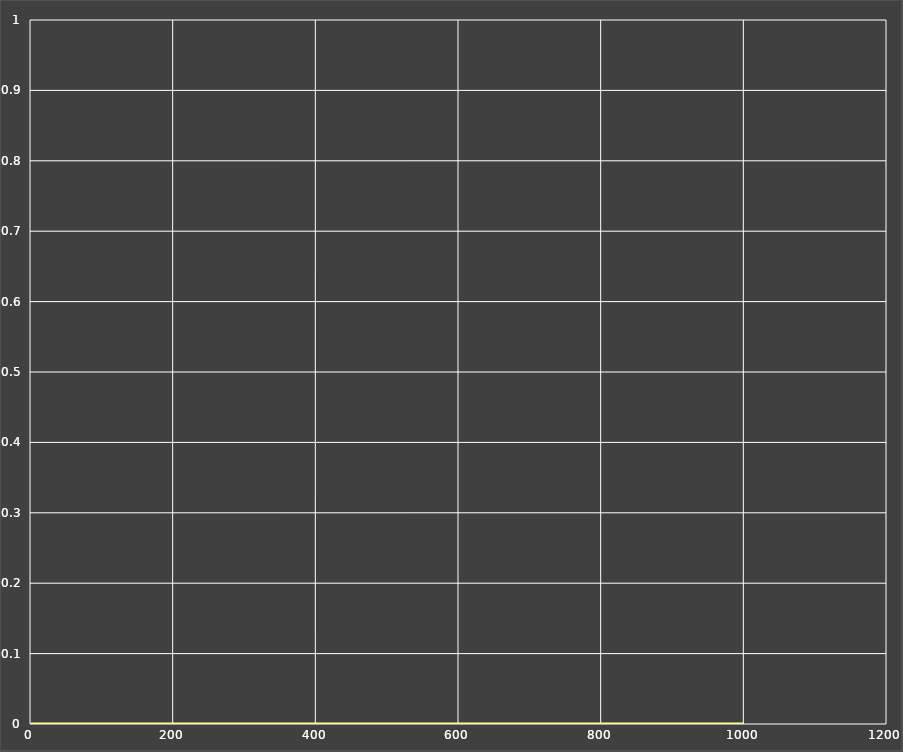
| Category | Nyquist |
|---|---|
| 0.9991501637305895 | -0.04 |
| 0.9991343671949188 | -0.04 |
| 0.9991182770960546 | -0.041 |
| 0.9991018879806148 | -0.041 |
| 0.9990851942939946 | -0.041 |
| 0.9990681903784916 | -0.042 |
| 0.9990508704713954 | -0.042 |
| 0.9990332287030411 | -0.043 |
| 0.9990152590948289 | -0.043 |
| 0.998996955557205 | -0.043 |
| 0.9989783118876068 | -0.044 |
| 0.9989593217683693 | -0.044 |
| 0.9989399787645931 | -0.045 |
| 0.9989202763219736 | -0.045 |
| 0.9989002077645885 | -0.045 |
| 0.9988797662926473 | -0.046 |
| 0.9988589449801962 | -0.046 |
| 0.9988377367727824 | -0.047 |
| 0.9988161344850759 | -0.047 |
| 0.9987941307984454 | -0.048 |
| 0.9987717182584913 | -0.048 |
| 0.998748889272533 | -0.049 |
| 0.9987256361070489 | -0.049 |
| 0.9987019508850702 | -0.049 |
| 0.998677825583526 | -0.05 |
| 0.9986532520305412 | -0.05 |
| 0.9986282219026813 | -0.051 |
| 0.9986027267221499 | -0.051 |
| 0.9985767578539334 | -0.052 |
| 0.9985503065028913 | -0.052 |
| 0.9985233637107972 | -0.053 |
| 0.9984959203533205 | -0.053 |
| 0.998467967136956 | -0.054 |
| 0.9984394945958955 | -0.054 |
| 0.9984104930888433 | -0.055 |
| 0.9983809527957705 | -0.055 |
| 0.9983508637146129 | -0.056 |
| 0.9983202156579057 | -0.056 |
| 0.9982889982493576 | -0.057 |
| 0.9982572009203619 | -0.057 |
| 0.9982248129064434 | -0.058 |
| 0.9981918232436395 | -0.058 |
| 0.9981582207648163 | -0.059 |
| 0.9981239940959151 | -0.059 |
| 0.9980891316521329 | -0.06 |
| 0.9980536216340291 | -0.06 |
| 0.9980174520235643 | -0.061 |
| 0.9979806105800648 | -0.062 |
| 0.9979430848361128 | -0.062 |
| 0.997904862093363 | -0.063 |
| 0.9978659294182808 | -0.063 |
| 0.9978262736378027 | -0.064 |
| 0.9977858813349192 | -0.065 |
| 0.9977447388441743 | -0.065 |
| 0.9977028322470843 | -0.066 |
| 0.9976601473674721 | -0.066 |
| 0.9976166697667167 | -0.067 |
| 0.9975723847389152 | -0.068 |
| 0.9975272773059577 | -0.068 |
| 0.9974813322125106 | -0.069 |
| 0.9974345339209094 | -0.069 |
| 0.9973868666059583 | -0.07 |
| 0.9973383141496339 | -0.071 |
| 0.9972888601356941 | -0.071 |
| 0.9972384878441867 | -0.072 |
| 0.9971871802458594 | -0.073 |
| 0.9971349199964673 | -0.073 |
| 0.9970816894309772 | -0.074 |
| 0.9970274705576654 | -0.075 |
| 0.9969722450521098 | -0.075 |
| 0.9969159942510705 | -0.076 |
| 0.9968586991462617 | -0.077 |
| 0.9968003403780082 | -0.078 |
| 0.9967408982287882 | -0.078 |
| 0.996680352616657 | -0.079 |
| 0.9966186830885545 | -0.08 |
| 0.9965558688134877 | -0.08 |
| 0.9964918885755923 | -0.081 |
| 0.9964267207670672 | -0.082 |
| 0.996360343380981 | -0.083 |
| 0.9962927340039489 | -0.083 |
| 0.9962238698086776 | -0.084 |
| 0.9961537275463725 | -0.085 |
| 0.9960822835390121 | -0.086 |
| 0.996009513671479 | -0.087 |
| 0.9959353933835502 | -0.087 |
| 0.995859897661744 | -0.088 |
| 0.9957830010310169 | -0.089 |
| 0.9957046775463149 | -0.09 |
| 0.9956249007839686 | -0.091 |
| 0.9955436438329358 | -0.091 |
| 0.9954608792858859 | -0.092 |
| 0.9953765792301241 | -0.093 |
| 0.9952907152383519 | -0.094 |
| 0.995203258359262 | -0.095 |
| 0.9951141791079655 | -0.096 |
| 0.9950234474562457 | -0.097 |
| 0.9949310328226382 | -0.098 |
| 0.9948369040623325 | -0.098 |
| 0.9947410294568952 | -0.099 |
| 0.9946433767038058 | -0.1 |
| 0.9945439129058088 | -0.101 |
| 0.9944426045600739 | -0.102 |
| 0.9943394175471633 | -0.103 |
| 0.9942343171198019 | -0.104 |
| 0.9941272678914487 | -0.105 |
| 0.9940182338246633 | -0.106 |
| 0.9939071782192669 | -0.107 |
| 0.9937940637002908 | -0.108 |
| 0.9936788522057145 | -0.109 |
| 0.9935615049739829 | -0.11 |
| 0.9934419825313037 | -0.111 |
| 0.9933202446787208 | -0.112 |
| 0.9931962504789579 | -0.113 |
| 0.9930699582430293 | -0.114 |
| 0.9929413255166173 | -0.115 |
| 0.9928103090662043 | -0.116 |
| 0.9926768648649661 | -0.117 |
| 0.9925409480784136 | -0.118 |
| 0.9924025130497828 | -0.119 |
| 0.9922615132851698 | -0.12 |
| 0.9921179014384024 | -0.122 |
| 0.9919716292956502 | -0.123 |
| 0.991822647759762 | -0.124 |
| 0.9916709068343326 | -0.125 |
| 0.9915163556074892 | -0.126 |
| 0.9913589422353963 | -0.127 |
| 0.9911986139254744 | -0.128 |
| 0.9910353169193247 | -0.13 |
| 0.9908689964753594 | -0.131 |
| 0.9906995968511311 | -0.132 |
| 0.9905270612853533 | -0.133 |
| 0.9903513319796141 | -0.134 |
| 0.9901723500797721 | -0.136 |
| 0.989990055657032 | -0.137 |
| 0.989804387688694 | -0.138 |
| 0.9896152840385742 | -0.139 |
| 0.9894226814370876 | -0.141 |
| 0.98922651546099 | -0.142 |
| 0.9890267205127756 | -0.143 |
| 0.9888232297997199 | -0.145 |
| 0.9886159753125681 | -0.146 |
| 0.9884048878038604 | -0.147 |
| 0.9881898967658889 | -0.149 |
| 0.9879709304082812 | -0.15 |
| 0.9877479156352061 | -0.151 |
| 0.9875207780221927 | -0.153 |
| 0.9872894417925607 | -0.154 |
| 0.9870538297934535 | -0.156 |
| 0.9868138634714707 | -0.157 |
| 0.9865694628478907 | -0.158 |
| 0.9863205464934823 | -0.16 |
| 0.9860670315028943 | -0.161 |
| 0.9858088334686198 | -0.163 |
| 0.9855458664545306 | -0.164 |
| 0.9852780429689716 | -0.166 |
| 0.9850052739374122 | -0.167 |
| 0.9847274686746476 | -0.169 |
| 0.9844445348565442 | -0.17 |
| 0.9841563784913205 | -0.172 |
| 0.9838629038903625 | -0.174 |
| 0.9835640136385599 | -0.175 |
| 0.9832596085641645 | -0.177 |
| 0.9829495877081578 | -0.178 |
| 0.9826338482931263 | -0.18 |
| 0.9823122856916345 | -0.182 |
| 0.9819847933940925 | -0.183 |
| 0.9816512629761076 | -0.185 |
| 0.9813115840653183 | -0.187 |
| 0.9809656443077005 | -0.188 |
| 0.9806133293333401 | -0.19 |
| 0.980254522721668 | -0.192 |
| 0.9798891059661461 | -0.194 |
| 0.9795169584384044 | -0.195 |
| 0.9791379573518169 | -0.197 |
| 0.978751977724512 | -0.199 |
| 0.9783588923418128 | -0.201 |
| 0.9779585717180984 | -0.202 |
| 0.9775508840580799 | -0.204 |
| 0.9771356952174872 | -0.206 |
| 0.9767128686631581 | -0.208 |
| 0.9762822654325236 | -0.21 |
| 0.9758437440924852 | -0.212 |
| 0.9753971606976753 | -0.214 |
| 0.9749423687480981 | -0.216 |
| 0.9744792191461407 | -0.218 |
| 0.9740075601529525 | -0.22 |
| 0.9735272373441879 | -0.222 |
| 0.9730380935650998 | -0.224 |
| 0.9725399688849873 | -0.226 |
| 0.9720327005509861 | -0.228 |
| 0.9715161229411998 | -0.23 |
| 0.970990067517165 | -0.232 |
| 0.970454362775645 | -0.234 |
| 0.969908834199751 | -0.236 |
| 0.9693533042093818 | -0.238 |
| 0.9687875921109794 | -0.24 |
| 0.9682115140465983 | -0.243 |
| 0.9676248829422817 | -0.245 |
| 0.9670275084557424 | -0.247 |
| 0.9664191969233449 | -0.249 |
| 0.9657997513063865 | -0.251 |
| 0.9651689711366718 | -0.254 |
| 0.9645266524613821 | -0.256 |
| 0.9638725877872346 | -0.258 |
| 0.96320656602393 | -0.261 |
| 0.9625283724268882 | -0.263 |
| 0.9618377885392713 | -0.265 |
| 0.9611345921332898 | -0.268 |
| 0.9604185571507983 | -0.27 |
| 0.9596894536431729 | -0.272 |
| 0.9589470477104785 | -0.275 |
| 0.9581911014399224 | -0.277 |
| 0.9574213728435982 | -0.28 |
| 0.9566376157955211 | -0.282 |
| 0.9558395799679589 | -0.285 |
| 0.9550270107670604 | -0.287 |
| 0.9541996492677886 | -0.29 |
| 0.9533572321481586 | -0.293 |
| 0.9524994916227901 | -0.295 |
| 0.9516261553757803 | -0.298 |
| 0.9507369464929007 | -0.3 |
| 0.949831583393131 | -0.303 |
| 0.9489097797595337 | -0.306 |
| 0.9479712444694841 | -0.309 |
| 0.9470156815242609 | -0.311 |
| 0.9460427899780138 | -0.314 |
| 0.9450522638661172 | -0.317 |
| 0.9440437921329259 | -0.32 |
| 0.9430170585589459 | -0.322 |
| 0.9419717416874376 | -0.325 |
| 0.940907514750466 | -0.328 |
| 0.93982404559442 | -0.331 |
| 0.9387209966050177 | -0.334 |
| 0.9375980246318181 | -0.337 |
| 0.9364547809122643 | -0.34 |
| 0.9352909109952804 | -0.343 |
| 0.9341060546644463 | -0.346 |
| 0.9328998458607818 | -0.349 |
| 0.931671912605162 | -0.352 |
| 0.9304218769204009 | -0.355 |
| 0.929149354753032 | -0.358 |
| 0.9278539558948189 | -0.361 |
| 0.9265352839040367 | -0.364 |
| 0.9251929360265561 | -0.368 |
| 0.9238265031167744 | -0.371 |
| 0.9224355695584358 | -0.374 |
| 0.9210197131853821 | -0.377 |
| 0.9195785052022852 | -0.381 |
| 0.9181115101054066 | -0.384 |
| 0.9166182856034376 | -0.387 |
| 0.9150983825384778 | -0.391 |
| 0.9135513448072002 | -0.394 |
| 0.9119767092822747 | -0.397 |
| 0.9103740057341015 | -0.401 |
| 0.9087427567529288 | -0.404 |
| 0.9070824776714196 | -0.408 |
| 0.9053926764877394 | -0.411 |
| 0.9036728537892437 | -0.415 |
| 0.9019225026768408 | -0.418 |
| 0.9001411086901143 | -0.422 |
| 0.8983281497332919 | -0.425 |
| 0.8964830960021487 | -0.429 |
| 0.894605409911942 | -0.433 |
| 0.8926945460264721 | -0.436 |
| 0.8907499509883752 | -0.44 |
| 0.8887710634507526 | -0.444 |
| 0.8867573140102475 | -0.447 |
| 0.8847081251416883 | -0.451 |
| 0.8826229111344134 | -0.455 |
| 0.8805010780304087 | -0.459 |
| 0.8783420235643867 | -0.463 |
| 0.8761451371059398 | -0.466 |
| 0.8739097996039152 | -0.47 |
| 0.8716353835331531 | -0.474 |
| 0.8693212528437436 | -0.478 |
| 0.8669667629129613 | -0.482 |
| 0.8645712605000389 | -0.486 |
| 0.8621340837039554 | -0.49 |
| 0.8596545619244136 | -0.494 |
| 0.8571320158261907 | -0.498 |
| 0.854565757307054 | -0.502 |
| 0.851955089469441 | -0.506 |
| 0.8492993065961029 | -0.511 |
| 0.8465976941299335 | -0.515 |
| 0.8438495286581968 | -0.519 |
| 0.8410540779013798 | -0.523 |
| 0.8382106007069139 | -0.527 |
| 0.835318347048002 | -0.532 |
| 0.8323765580278065 | -0.536 |
| 0.8293844658892603 | -0.54 |
| 0.8263412940307678 | -0.544 |
| 0.8232462570280781 | -0.549 |
| 0.8200985606626151 | -0.553 |
| 0.8168974019565658 | -0.557 |
| 0.8136419692150314 | -0.562 |
| 0.8103314420755584 | -0.566 |
| 0.8069649915653779 | -0.571 |
| 0.8035417801666908 | -0.575 |
| 0.8000609618903448 | -0.58 |
| 0.7965216823582649 | -0.584 |
| 0.7929230788950018 | -0.588 |
| 0.7892642806287868 | -0.593 |
| 0.7855444086024744 | -0.598 |
| 0.7817625758947864 | -0.602 |
| 0.7779178877522651 | -0.607 |
| 0.7740094417323644 | -0.611 |
| 0.7700363278581212 | -0.616 |
| 0.7659976287848487 | -0.62 |
| 0.7618924199793266 | -0.625 |
| 0.7577197699119546 | -0.63 |
| 0.7534787402623604 | -0.634 |
| 0.7491683861389656 | -0.639 |
| 0.744787756313019 | -0.644 |
| 0.7403358934676256 | -0.648 |
| 0.7358118344623135 | -0.653 |
| 0.731214610613687 | -0.658 |
| 0.7265432479927353 | -0.663 |
| 0.7217967677393728 | -0.667 |
| 0.7169741863948089 | -0.672 |
| 0.7120745162523425 | -0.677 |
| 0.707096765727212 | -0.681 |
| 0.7020399397461238 | -0.686 |
| 0.6969030401571047 | -0.691 |
| 0.6916850661603424 | -0.696 |
| 0.6863850147606742 | -0.7 |
| 0.6810018812424166 | -0.705 |
| 0.6755346596672237 | -0.71 |
| 0.6699823433956869 | -0.715 |
| 0.6643439256333912 | -0.719 |
| 0.6586184000021629 | -0.724 |
| 0.6528047611372474 | -0.729 |
| 0.6469020053111709 | -0.734 |
| 0.6409091310850527 | -0.738 |
| 0.6348251399881327 | -0.743 |
| 0.6286490372263078 | -0.748 |
| 0.6223798324204571 | -0.752 |
| 0.6160165403753636 | -0.757 |
| 0.6095581818800322 | -0.762 |
| 0.6030037845402217 | -0.766 |
| 0.5963523836440049 | -0.771 |
| 0.5896030230611843 | -0.776 |
| 0.5827547561773845 | -0.78 |
| 0.5758066468636579 | -0.785 |
| 0.568757770482425 | -0.789 |
| 0.5616072149305893 | -0.794 |
| 0.5543540817206526 | -0.798 |
| 0.5469974871006545 | -0.803 |
| 0.5395365632137659 | -0.807 |
| 0.5319704592983484 | -0.812 |
| 0.5242983429292923 | -0.816 |
| 0.5165194013014316 | -0.82 |
| 0.5086328425558272 | -0.825 |
| 0.5006378971496946 | -0.829 |
| 0.492533819270735 | -0.833 |
| 0.48431988829661177 | -0.837 |
| 0.4759954103003018 | -0.841 |
| 0.4675597196020108 | -0.845 |
| 0.4590121803683403 | -0.849 |
| 0.450352188259339 | -0.853 |
| 0.4415791721240683 | -0.857 |
| 0.4326925957452532 | -0.861 |
| 0.42369195963356426 | -0.865 |
| 0.414576802872041 | -0.868 |
| 0.40534670501110487 | -0.872 |
| 0.39600128801458184 | -0.875 |
| 0.3865402182570908 | -0.879 |
| 0.3769632085730966 | -0.882 |
| 0.36727002035788253 | -0.886 |
| 0.357460465720607 | -0.889 |
| 0.3475344096895692 | -0.892 |
| 0.33749177246970796 | -0.895 |
| 0.3273325317523055 | -0.898 |
| 0.3170567250767599 | -0.901 |
| 0.30666445224422145 | -0.904 |
| 0.29615587778278674 | -0.906 |
| 0.28553123346383924 | -0.909 |
| 0.27479082086903533 | -0.911 |
| 0.26393501400730895 | -0.914 |
| 0.25296426198115934 | -0.916 |
| 0.24187909170136979 | -0.918 |
| 0.23068011064915755 | -0.92 |
| 0.21936800968464337 | -0.922 |
| 0.2079435659003741 | -0.924 |
| 0.19640764551847859 | -0.925 |
| 0.18476120682989952 | -0.927 |
| 0.17300530317397 | -0.928 |
| 0.1611410859564299 | -0.929 |
| 0.14916980770381716 | -0.93 |
| 0.1370928251519746 | -0.931 |
| 0.12491160236622474 | -0.932 |
| 0.11262771389056714 | -0.932 |
| 0.10024284792305546 | -0.933 |
| 0.08775880951428339 | -0.933 |
| 0.07517752378571378 | -0.933 |
| 0.0625010391643268 | -0.933 |
| 0.04973153062986233 | -0.932 |
| 0.0368713029706649 | -0.932 |
| 0.02392279404390339 | -0.931 |
| 0.010888578035684026 | -0.93 |
| -0.002228631283699712 | -0.929 |
| -0.015425977314382755 | -0.928 |
| -0.028700457396720308 | -0.926 |
| -0.042048919601811 | -0.925 |
| -0.05546805954862648 | -0.923 |
| -0.06895441725389852 | -0.92 |
| -0.08250437402121472 | -0.918 |
| -0.09611414937608918 | -0.915 |
| -0.10977979805407521 | -0.913 |
| -0.12349720704929167 | -0.909 |
| -0.13726209273108064 | -0.906 |
| -0.15106999803680063 | -0.903 |
| -0.16491628974910985 | -0.899 |
| -0.17879615586640132 | -0.895 |
| -0.1927046030753933 | -0.89 |
| -0.20663645433519842 | -0.886 |
| -0.2205863465825267 | -0.881 |
| -0.23454872856800038 | -0.876 |
| -0.2485178588338993 | -0.87 |
| -0.26248780384396114 | -0.865 |
| -0.27645243627619664 | -0.859 |
| -0.290405433489987 | -0.852 |
| -0.30434027617905746 | -0.846 |
| -0.31825024722220174 | -0.839 |
| -0.33212843074395865 | -0.832 |
| -0.3459677113977141 | -0.824 |
| -0.3597607738839836 | -0.817 |
| -0.37350010271691025 | -0.809 |
| -0.38717798225225186 | -0.8 |
| -0.4007864969903987 | -0.792 |
| -0.4143175321681661 | -0.783 |
| -0.42776277465333373 | -0.773 |
| -0.4411137141560984 | -0.764 |
| -0.45436164477176755 | -0.754 |
| -0.4674976668691868 | -0.743 |
| -0.4805126893395253 | -0.733 |
| -0.49339743222013777 | -0.722 |
| -0.5061424297083106 | -0.711 |
| -0.5187380335797571 | -0.699 |
| -0.5311744170267325 | -0.687 |
| -0.5434415789306518 | -0.675 |
| -0.5555293485840334 | -0.663 |
| -0.5674273908765299 | -0.65 |
| -0.5791252119596871 | -0.637 |
| -0.590612165404914 | -0.623 |
| -0.6018774588689798 | -0.609 |
| -0.6129101612810808 | -0.595 |
| -0.62369921056528 | -0.581 |
| -0.6342334219117712 | -0.566 |
| -0.6445014966100623 | -0.551 |
| -0.6544920314567394 | -0.536 |
| -0.6641935287500114 | -0.52 |
| -0.6735944068826909 | -0.504 |
| -0.6826830115447058 | -0.488 |
| -0.6914476275455774 | -0.471 |
| -0.6998764912666106 | -0.454 |
| -0.7079578037517842 | -0.437 |
| -0.7156797444455028 | -0.42 |
| -0.723030485584487 | -0.402 |
| -0.7299982072501321 | -0.384 |
| -0.7365711130866363 | -0.366 |
| -0.7427374466891222 | -0.347 |
| -0.7484855086648111 | -0.329 |
| -0.7538036743690775 | -0.31 |
| -0.7586804123169154 | -0.29 |
| -0.7631043032689585 | -0.271 |
| -0.7670640599897511 | -0.252 |
| -0.7705485476744303 | -0.232 |
| -0.7735468050383696 | -0.212 |
| -0.7760480660626449 | -0.192 |
| -0.7780417823864152 | -0.171 |
| -0.7795176463354525 | -0.151 |
| -0.7804656145741301 | -0.131 |
| -0.7808759323661503 | -0.11 |
| -0.7807391584272015 | -0.089 |
| -0.7800461903505397 | -0.068 |
| -0.7787882905842269 | -0.047 |
| -0.7769571129363981 | -0.026 |
| -0.7745447295824871 | -0.005 |
| -0.7715436585458224 | 0.016 |
| -0.767946891620382 | 0.037 |
| -0.7637479227018082 | 0.057 |
| -0.7589407764899985 | 0.078 |
| -0.7535200375237234 | 0.099 |
| -0.7474808795047758 | 0.12 |
| -0.7408190948661221 | 0.141 |
| -0.7335311245354234 | 0.161 |
| -0.7256140878420901 | 0.182 |
| -0.7170658125127859 | 0.202 |
| -0.7078848646969339 | 0.222 |
| -0.6980705789603807 | 0.242 |
| -0.6876230881818806 | 0.262 |
| -0.6765433532835164 | 0.281 |
| -0.6648331927225585 | 0.3 |
| -0.6524953116685975 | 0.319 |
| -0.6395333307860666 | 0.338 |
| -0.625951814538487 | 0.356 |
| -0.6117562989269815 | 0.374 |
| -0.5969533185717343 | 0.391 |
| -0.5815504330412251 | 0.408 |
| -0.5655562523301564 | 0.424 |
| -0.5489804613831231 | 0.44 |
| -0.5318338435571486 | 0.456 |
| -0.5141283029123545 | 0.471 |
| -0.4958768852161661 | 0.485 |
| -0.4770937975426399 | 0.499 |
| -0.45779442634473916 | 0.513 |
| -0.43799535387369554 | 0.525 |
| -0.4177143728159986 | 0.537 |
| -0.3969704990150419 | 0.549 |
| -0.37578398214111897 | 0.559 |
| -0.35417631417022455 | 0.569 |
| -0.3321702355290945 | 0.578 |
| -0.30978973876107263 | 0.587 |
| -0.28706006956479513 | 0.595 |
| -0.26400772505533293 | 0.601 |
| -0.24066044909537576 | 0.607 |
| -0.2170472245423378 | 0.613 |
| -0.19319826225586004 | 0.617 |
| -0.169144986709275 | 0.62 |
| -0.14492001804804558 | 0.623 |
| -0.12055715043817536 | 0.624 |
| -0.09609132654810548 | 0.625 |
| -0.07155860800868075 | 0.625 |
| -0.046996141697500264 | 0.624 |
| -0.02244212169639632 | 0.622 |
| 0.002064253226100385 | 0.618 |
| 0.026482826751454386 | 0.614 |
| 0.05077253690632383 | 0.609 |
| 0.0748914728498568 | 0.603 |
| 0.09879693667995511 | 0.596 |
| 0.12244551037755924 | 0.588 |
| 0.14579312799910366 | 0.579 |
| 0.1687951532171679 | 0.569 |
| 0.19140646229796904 | 0.558 |
| 0.21358153259160792 | 0.546 |
| 0.23527453659685782 | 0.534 |
| 0.2564394416466467 | 0.52 |
| 0.2770301152432278 | 0.505 |
| 0.297000436053208 | 0.489 |
| 0.31630441055212494 | 0.473 |
| 0.33489629528598036 | 0.456 |
| 0.35273072469306704 | 0.437 |
| 0.369762844403432 | 0.418 |
| 0.38594844990542526 | 0.399 |
| 0.4012441304388632 | 0.378 |
| 0.41560741794240774 | 0.357 |
| 0.4289969408487621 | 0.335 |
| 0.44137258248520317 | 0.312 |
| 0.4526956437987911 | 0.289 |
| 0.46292901008529386 | 0.265 |
| 0.4720373213585252 | 0.241 |
| 0.47998714595234077 | 0.217 |
| 0.4867471569011308 | 0.192 |
| 0.4922883105962478 | 0.166 |
| 0.4965840271656047 | 0.141 |
| 0.4996103719716856 | 0.115 |
| 0.5013462375696541 | 0.089 |
| 0.5017735254122155 | 0.063 |
| 0.500877326531634 | 0.037 |
| 0.498646100372021 | 0.011 |
| 0.49507185088697353 | -0.015 |
| 0.49015029895913886 | -0.041 |
| 0.4838810501396658 | -0.067 |
| 0.4762677566471236 | -0.092 |
| 0.4673182725078024 | -0.116 |
| 0.4570448006627314 | -0.141 |
| 0.4454640308118954 | -0.164 |
| 0.4325972667134449 | -0.187 |
| 0.4184705416058734 | -0.21 |
| 0.40311472037480534 | -0.231 |
| 0.3865655870439258 | -0.252 |
| 0.368863916132461 | -0.272 |
| 0.35005552639030313 | -0.29 |
| 0.33019131539724705 | -0.308 |
| 0.3093272734957817 | -0.324 |
| 0.28752447551843774 | -0.339 |
| 0.2648490487718529 | -0.353 |
| 0.2413721157515344 | -0.366 |
| 0.21716971008485422 | -0.377 |
| 0.19232266423627584 | -0.387 |
| 0.16691646755928302 | -0.395 |
| 0.14104109334515266 | -0.401 |
| 0.114790793600754 | -0.406 |
| 0.08826386038714444 | -0.409 |
| 0.0615623526689382 | -0.411 |
| 0.034791787762512044 | -0.411 |
| 0.008060796629933637 | -0.409 |
| -0.018519257553722898 | -0.406 |
| -0.04483469792859894 | -0.401 |
| -0.07076998971568377 | -0.394 |
| -0.09620823311058585 | -0.385 |
| -0.12103169292025628 | -0.375 |
| -0.14512236425661698 | -0.363 |
| -0.1683625732751158 | -0.349 |
| -0.1906356115953306 | -0.334 |
| -0.21182640266546532 | -0.318 |
| -0.2318221979335505 | -0.3 |
| -0.2505133002665852 | -0.28 |
| -0.2677938116162647 | -0.259 |
| -0.28356240146819406 | -0.237 |
| -0.29772309213312964 | -0.214 |
| -0.310186056446611 | -0.191 |
| -0.32086842294088347 | -0.166 |
| -0.32969508304426187 | -0.14 |
| -0.33659949435266684 | -0.114 |
| -0.3415244735112461 | -0.087 |
| -0.3444229717466531 | -0.06 |
| -0.34525882560928084 | -0.033 |
| -0.3440074750267488 | -0.006 |
| -0.3406566403431355 | 0.021 |
| -0.3352069496313891 | 0.047 |
| -0.32767250722824126 | 0.073 |
| -0.318081394161581 | 0.099 |
| -0.3064760909299721 | 0.123 |
| -0.29291381296364444 | 0.147 |
| -0.277466749057071 | 0.169 |
| -0.26022219312667716 | 0.19 |
| -0.24128255982499683 | 0.21 |
| -0.2207652748463466 | 0.227 |
| -0.19880253120038197 | 0.243 |
| -0.17554090331984928 | 0.258 |
| -0.1511408116180362 | 0.27 |
| -0.1257758310295561 | 0.28 |
| -0.0996318381637031 | 0.287 |
| -0.0729059929799745 | 0.293 |
| -0.045805552365646776 | 0.295 |
| -0.01854651465900034 | 0.296 |
| 0.008647903980488893 | 0.294 |
| 0.03554895840396595 | 0.289 |
| 0.061924223319679166 | 0.282 |
| 0.08753959455301373 | 0.273 |
| 0.11216143254081891 | 0.261 |
| 0.1355588351559868 | 0.247 |
| 0.1575060241092664 | 0.231 |
| 0.1777848262298445 | 0.213 |
| 0.19618722791752571 | 0.192 |
| 0.21251797802617797 | 0.17 |
| 0.2265972114254316 | 0.147 |
| 0.2382630625459189 | 0.122 |
| 0.24737423539941109 | 0.097 |
| 0.253812493941221 | 0.07 |
| 0.25748503427591235 | 0.043 |
| 0.25832669817128 | 0.015 |
| 0.2563019857164165 | -0.012 |
| 0.2514068238175618 | -0.039 |
| 0.24367004665249878 | -0.065 |
| 0.23315454428353855 | -0.09 |
| 0.21995803644281486 | -0.114 |
| 0.20421343013120183 | -0.137 |
| 0.18608872218837366 | -0.157 |
| 0.16578641146382603 | -0.176 |
| 0.14354238970479172 | -0.192 |
| 0.11962428582185489 | -0.205 |
| 0.09432924482608201 | -0.216 |
| 0.06798113046302505 | -0.223 |
| 0.040927149387423076 | -0.228 |
| 0.013533904590726387 | -0.229 |
| -0.0138171033538235 | -0.227 |
| -0.040734496924115654 | -0.222 |
| -0.06682252136021395 | -0.213 |
| -0.09168696757044936 | -0.201 |
| -0.11494144888478107 | -0.187 |
| -0.1362139487068427 | -0.17 |
| -0.15515354266392875 | -0.15 |
| -0.1714371858737335 | -0.128 |
| -0.18477644379696298 | -0.104 |
| -0.19492403421748788 | -0.078 |
| -0.20168003860500425 | -0.052 |
| -0.20489763390794474 | -0.024 |
| -0.20448819114656205 | 0.003 |
| -0.2004255854782776 | 0.03 |
| -0.19274956412797042 | 0.057 |
| -0.1815680241266392 | 0.082 |
| -0.16705806155151942 | 0.105 |
| -0.14946566821695334 | 0.126 |
| -0.1291039707555554 | 0.145 |
| -0.10634993088039692 | 0.16 |
| -0.08163945433713989 | 0.172 |
| -0.05546088950494104 | 0.181 |
| -0.028346934490873985 | 0.185 |
| -0.0008650134111045224 | 0.186 |
| 0.026393772302547365 | 0.182 |
| 0.052826964157573715 | 0.174 |
| 0.07783413607612127 | 0.163 |
| 0.10083110174922387 | 0.148 |
| 0.12126464093400699 | 0.13 |
| 0.1386274012264482 | 0.108 |
| 0.1524725921814348 | 0.084 |
| 0.16242805578166122 | 0.059 |
| 0.16820927315865547 | 0.032 |
| 0.16963085412466658 | 0.004 |
| 0.16661605539080104 | -0.023 |
| 0.159203887075177 | -0.049 |
| 0.14755339674403584 | -0.074 |
| 0.1319447669264845 | -0.097 |
| 0.11277692649117951 | -0.117 |
| 0.09056145860073099 | -0.133 |
| 0.0659126876340264 | -0.145 |
| 0.03953394320121117 | -0.153 |
| 0.01220012905354608 | -0.156 |
| -0.015263134689612656 | -0.154 |
| -0.04200337991999904 | -0.148 |
| -0.06716760356287486 | -0.137 |
| -0.08993031280303045 | -0.121 |
| -0.10952245338101038 | -0.102 |
| -0.12526025186074755 | -0.079 |
| -0.136572906830877 | -0.054 |
| -0.14302799946348504 | -0.028 |
| -0.1443534678319816 | 0 |
| -0.14045500835798813 | 0.027 |
| -0.1314278371223699 | 0.053 |
| -0.11756186742657651 | 0.077 |
| -0.09933953984008607 | 0.098 |
| -0.07742577651392765 | 0.114 |
| -0.05264981946232408 | 0.126 |
| -0.025979046367031168 | 0.133 |
| 0.0015147725433026181 | 0.134 |
| 0.02869592002535928 | 0.13 |
| 0.05441062378428612 | 0.12 |
| 0.07753675231075262 | 0.105 |
| 0.09703532011652108 | 0.086 |
| 0.11200151394707285 | 0.063 |
| 0.12171273936490735 | 0.037 |
| 0.1256710796251799 | 0.01 |
| 0.12363757660920388 | -0.018 |
| 0.11565590333560019 | -0.044 |
| 0.1020633100953583 | -0.068 |
| 0.08348719499495484 | -0.088 |
| 0.060826269127063314 | -0.104 |
| 0.03521604102199721 | -0.114 |
| 0.007979207796724804 | -0.118 |
| -0.019437526307942557 | -0.116 |
| -0.04553772794179954 | -0.107 |
| -0.06885721327679889 | -0.092 |
| -0.08804951135768148 | -0.073 |
| -0.10196994414798637 | -0.049 |
| -0.10975303817760658 | -0.022 |
| -0.11087786219235293 | 0.005 |
| -0.105216111519318 | 0.032 |
| -0.09305836622702467 | 0.057 |
| -0.0751149472208805 | 0.078 |
| -0.052489165366039765 | 0.093 |
| -0.026622455714607317 | 0.103 |
| 0.0007871687327828294 | 0.105 |
| 0.027889834419485813 | 0.1 |
| 0.052806120585805034 | 0.089 |
| 0.07375950007580562 | 0.071 |
| 0.08920989406799243 | 0.048 |
| 0.09797830540463537 | 0.022 |
| 0.09935215535461586 | -0.005 |
| 0.09316141626189196 | -0.032 |
| 0.0798169825747529 | -0.056 |
| 0.06030496367207787 | -0.076 |
| 0.0361336428494849 | -0.089 |
| 0.009233570029346418 | -0.095 |
| -0.018184604009685662 | -0.092 |
| -0.043805711356119714 | -0.082 |
| -0.06540628884953928 | -0.065 |
| -0.08105543212764262 | -0.043 |
| -0.08930217899545029 | -0.017 |
| -0.0893307208476363 | 0.011 |
| -0.08106591504362641 | 0.037 |
| -0.06521465051294376 | 0.06 |
| -0.04323355431885194 | 0.076 |
| -0.017220060017126233 | 0.085 |
| 0.01026848710081995 | 0.085 |
| 0.03645491694417607 | 0.077 |
| 0.05862104557604818 | 0.061 |
| 0.07439837389337514 | 0.038 |
| 0.08203972373349702 | 0.012 |
| 0.08063980647576191 | -0.016 |
| 0.07027528737787242 | -0.041 |
| 0.052041306095751715 | -0.062 |
| 0.027971397518422633 | -0.075 |
| 0.0008405857792354647 | -0.079 |
| -0.026134134565810697 | -0.074 |
| -0.049667309497616045 | -0.06 |
| -0.06681144590083998 | -0.038 |
| -0.0753466960871882 | -0.012 |
| -0.07410122814155705 | 0.015 |
| -0.06315361422516268 | 0.04 |
| -0.043879748828734515 | 0.06 |
| -0.01882468822543424 | 0.071 |
| 0.008597280237799739 | 0.072 |
| 0.03454577044104603 | 0.063 |
| 0.055287956336256286 | 0.045 |
| 0.0677510141851144 | 0.021 |
| 0.0700112899905882 | -0.006 |
| 0.06163947239968626 | -0.032 |
| 0.04383549410987059 | -0.053 |
| 0.019313920175687477 | -0.066 |
| -0.008062534815284551 | -0.067 |
| -0.033861888530582286 | -0.058 |
| -0.05379449691257908 | -0.039 |
| -0.06444648848830736 | -0.014 |
| -0.06390880273625153 | 0.014 |
| -0.05218125730518032 | 0.038 |
| -0.03125964236752656 | 0.056 |
| -0.004863193876286502 | 0.063 |
| 0.022176628568415707 | 0.059 |
| 0.04477779807653303 | 0.043 |
| 0.058573377996036236 | 0.02 |
| 0.060798883340168745 | -0.008 |
| 0.05091610420091326 | -0.033 |
| 0.03082344827125739 | -0.052 |
| 0.00457430099786935 | -0.059 |
| -0.022377930778711592 | -0.055 |
| -0.04428441874279111 | -0.038 |
| -0.05634122517752181 | -0.014 |
| -0.05579872599803392 | 0.014 |
| -0.042676137636186676 | 0.038 |
| -0.019882264382890286 | 0.053 |
| 0.00733560962530951 | 0.055 |
| 0.03253808325751929 | 0.045 |
| 0.04960404705433148 | 0.023 |
| 0.05425882405582178 | -0.003 |
| 0.045233622028606466 | -0.029 |
| 0.024726032850738384 | -0.047 |
| -0.0020176553126564152 | -0.053 |
| -0.027959461595400043 | -0.044 |
| -0.04609312060918913 | -0.024 |
| -0.05137500219262043 | 0.003 |
| -0.042226129408698576 | 0.029 |
| -0.021137947870805158 | 0.046 |
| 0.005869644428011406 | 0.05 |
| 0.03087154786733325 | 0.039 |
| 0.04633921938695127 | 0.016 |
| 0.04746658677742095 | -0.011 |
| 0.03379138821010664 | -0.034 |
| 0.009535316563829874 | -0.047 |
| -0.017553380315248945 | -0.044 |
| -0.03859473083059445 | -0.027 |
| -0.04650349988960828 | -0.001 |
| -0.03848641807861789 | 0.025 |
| -0.017202361275395314 | 0.042 |
| 0.009936902671198887 | 0.044 |
| 0.03322480329777565 | 0.03 |
| 0.04411536414013612 | 0.005 |
| 0.0384617446040503 | -0.021 |
| 0.018284055006660985 | -0.04 |
| -0.008740523030550729 | -0.042 |
| -0.03204964650883675 | -0.028 |
| -0.042298700981872876 | -0.003 |
| -0.03522257834471928 | 0.023 |
| -0.013626844128037002 | 0.039 |
| 0.013488585493290363 | 0.039 |
| 0.03452770979536128 | 0.022 |
| 0.040258120178736964 | -0.005 |
| 0.0280241380166379 | -0.029 |
| 0.0032352633963402748 | -0.04 |
| -0.022779800200304384 | -0.032 |
| -0.037835259716262865 | -0.01 |
| -0.03467296531124698 | 0.017 |
| -0.014703596460128273 | 0.035 |
| 0.012318884973500348 | 0.036 |
| 0.03285150691713516 | 0.018 |
| 0.0363410850391089 | -0.008 |
| 0.020856334825044315 | -0.031 |
| -0.005519263450057964 | -0.036 |
| -0.028627562132074555 | -0.022 |
| -0.03576027634100008 | 0.004 |
| -0.022829152099992544 | 0.027 |
| 0.0029422208199874874 | 0.035 |
| 0.02672496880610288 | 0.023 |
| 0.03450475733977498 | -0.003 |
| 0.02152107422484244 | -0.027 |
| -0.004439563118585931 | -0.034 |
| -0.027353673074092543 | -0.02 |
| -0.03274074909321546 | 0.007 |
| -0.017036214418375967 | 0.028 |
| 0.00962375774616787 | 0.031 |
| 0.029579922608829367 | 0.013 |
| 0.02929529656891235 | -0.013 |
| 0.008849604619956234 | -0.031 |
| -0.017556987143552496 | -0.026 |
| -0.03114904569959587 | -0.003 |
| -0.022006525236010786 | 0.022 |
| 0.0032550293960290303 | 0.031 |
| 0.02577822878745515 | 0.016 |
| 0.028366243544348937 | -0.01 |
| 0.008906388351339646 | -0.029 |
| -0.017353658081736265 | -0.024 |
| -0.029362724851768003 | 0 |
| -0.017241356866730537 | 0.023 |
| 0.009059267043514492 | 0.027 |
| 0.02738477501092425 | 0.008 |
| 0.02194863049553476 | -0.018 |
| -0.0026082572982713574 | -0.028 |
| -0.024543792479689547 | -0.013 |
| -0.024015696490096865 | 0.013 |
| -0.0014111854092087044 | 0.027 |
| 0.02223017011227798 | 0.015 |
| 0.024435563544811516 | -0.011 |
| 0.002985300191850433 | -0.026 |
| -0.021127449013063 | -0.016 |
| -0.02380976796133541 | 0.011 |
| -0.002254598235485309 | 0.026 |
| 0.021351958533225118 | 0.014 |
| 0.022214889622206874 | -0.012 |
| -0.0006657824915148969 | -0.025 |
| -0.022522044496882963 | -0.011 |
| -0.019222199722578874 | 0.015 |
| 0.005608164437342544 | 0.024 |
| 0.023706873297828144 | 0.005 |
| 0.014067906593153745 | -0.019 |
| -0.012022954873080515 | -0.02 |
| -0.02335189460663632 | 0.003 |
| -0.0060890072857689125 | 0.023 |
| 0.01846990172594555 | 0.014 |
| 0.019455931948619432 | -0.012 |
| -0.004438792858384029 | -0.022 |
| -0.02222970342774348 | -0.003 |
| -0.010428880199343451 | 0.02 |
| 0.015187112733368436 | 0.016 |
| 0.01973939835170147 | -0.009 |
| -0.00309973349895728 | -0.021 |
| -0.021243268114526117 | -0.003 |
| -0.008767248623549388 | 0.019 |
| 0.016246296166525658 | 0.013 |
| 0.016931506969267818 | -0.012 |
| -0.007747614429640174 | -0.019 |
| -0.02026467605676879 | 0.003 |
| -0.0012856574569980873 | 0.02 |
| 0.019413980669981918 | 0.005 |
| 0.008860228655547978 | -0.018 |
| -0.01585866790059041 | -0.012 |
| -0.01413251992033882 | 0.014 |
| 0.011134845043530687 | 0.016 |
| 0.017136109735673068 | -0.009 |
| -0.0064170875869152925 | -0.018 |
| -0.01838063824984934 | 0.004 |
| 0.0024130797877021976 | 0.019 |
| 0.01851529474632076 | -0.001 |
| 0.0005578605563451982 | -0.018 |
| -0.018121099228782345 | -0.002 |
| -0.002421379947368354 | 0.018 |
| 0.017617108153493332 | 0.003 |
| 0.0032139592134360537 | -0.017 |
| -0.017236699076873006 | -0.003 |
| -0.0029908159129846544 | 0.017 |
| 0.017032257936613563 | 0.003 |
| 0.0017844166825339385 | -0.017 |
| -0.016882203501186882 | -0.001 |
| 0.0003861008256646663 | 0.017 |
| 0.01649383277457017 | -0.002 |
| -0.003454470496484026 | -0.016 |
| -0.01541632014278772 | 0.005 |
| 0.007197982177596649 | 0.014 |
| 0.013099434561949752 | -0.009 |
| -0.011097374131469608 | -0.011 |
| -0.009048935889833305 | 0.013 |
| 0.014223391849689713 | 0.006 |
| 0.003120366317872035 | -0.015 |
| -0.015268701696598542 | 0 |
| 0.004074047525034663 | 0.015 |
| 0.012892970008514382 | -0.008 |
| -0.010824650652506443 | -0.01 |
| -0.006498036439694465 | 0.013 |
| 0.014438869981693926 | 0.002 |
| -0.002725621358539834 | -0.014 |
| -0.0122865020532201 | 0.007 |
| 0.011176411861629168 | 0.009 |
| 0.0038624121752228145 | -0.014 |
| -0.01382107614118716 | 0.002 |
| 0.007180155597658315 | 0.012 |
| 0.00753405510387688 | -0.011 |
| -0.013445658322497516 | -0.002 |
| 0.0046428082049253284 | 0.013 |
| 0.008783098622600547 | -0.01 |
| -0.012904404435907716 | -0.003 |
| 0.0042279612627479255 | 0.012 |
| 0.00820358725153067 | -0.01 |
| -0.012741279641577256 | -0.001 |
| 0.005884602697899119 | 0.011 |
| 0.0057588830589501 | -0.011 |
| -0.012315320426813426 | 0.002 |
| 0.008983242150501497 | 0.008 |
| 0.0010000697838415834 | -0.012 |
| -0.009914960698396012 | 0.007 |
| 0.011678615359149824 | 0.003 |
| -0.00569682413501039 | -0.01 |
| -0.0036294436336456854 | 0.011 |
| 0.010434009419929276 | -0.005 |
| -0.01107147469907167 | -0.003 |
| 0.005758346055533044 | 0.01 |
| 0.0022421698718720837 | -0.011 |
| -0.008827983104574947 | 0.007 |
| 0.011167586554093138 | 0 |
| -0.008714579327088013 | -0.007 |
| 0.0029638344920744127 | 0.011 |
| 0.0035833751486479613 | -0.01 |
| -0.00858076774081514 | 0.006 |
| 0.010626491568025023 | -0.001 |
| -0.009499152712175869 | -0.005 |
| 0.005932702542826708 | 0.009 |
| -0.0011575624952131912 | -0.01 |
| -0.0035656686990838122 | 0.01 |
| 0.00727462765743865 | -0.007 |
| -0.009448686465656456 | 0.004 |
| 0.009994349302153408 | 0 |